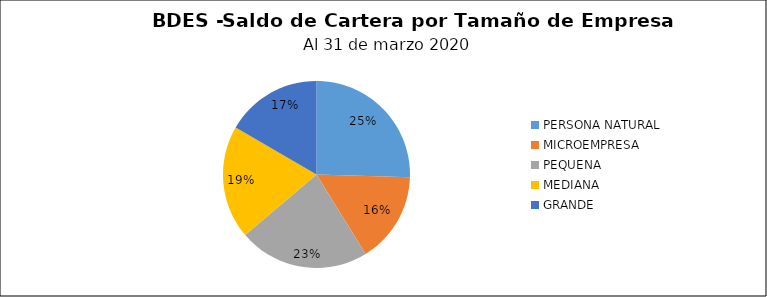
| Category | Saldo | Créditos |
|---|---|---|
| PERSONA NATURAL | 97.855 | 7469 |
| MICROEMPRESA | 60.264 | 9433 |
| PEQUENA | 86.829 | 2320 |
| MEDIANA | 75.156 | 421 |
| GRANDE | 63.832 | 199 |